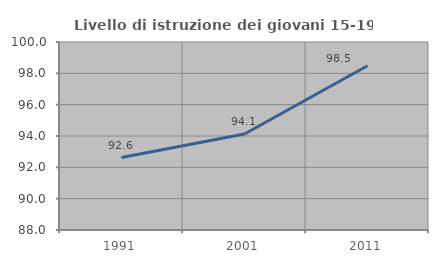
| Category | Livello di istruzione dei giovani 15-19 anni |
|---|---|
| 1991.0 | 92.622 |
| 2001.0 | 94.127 |
| 2011.0 | 98.482 |